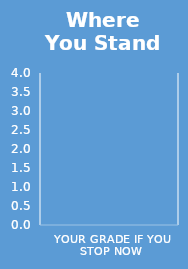
| Category | Your grade if you stop now |
|---|---|
| Your grade if you stop now | 0 |